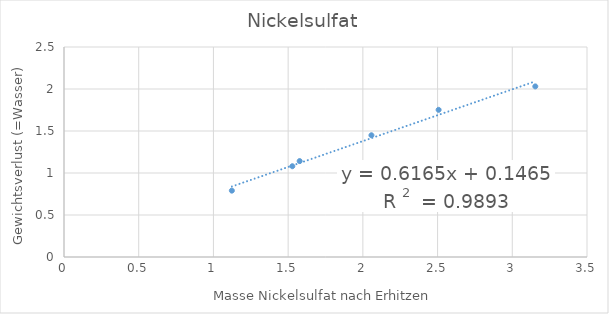
| Category | Series 0 |
|---|---|
| 2.0575 | 1.449 |
| 1.1233 | 0.79 |
| 1.577 | 1.142 |
| 2.507 | 1.752 |
| 1.5281 | 1.081 |
| 3.154 | 2.031 |